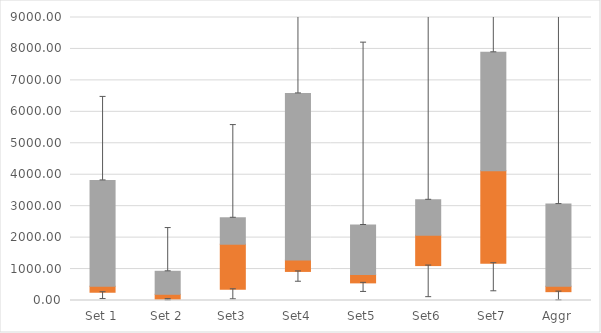
| Category | Q1 | Median-Q1 | Q3-Median |
|---|---|---|---|
| Set 1 | 262.42 | 191.104 | 3366.661 |
| Set 2 | 42.812 | 155.188 | 730.897 |
| Set3 | 356.171 | 1433.594 | 841.4 |
| Set4 | 924.39 | 364.249 | 5298.229 |
| Set5 | 560.473 | 263.255 | 1578.606 |
| Set6 | 1110.463 | 967.655 | 1124.999 |
| Set7 | 1186.183 | 2943.046 | 3764.981 |
| Aggr | 280.866 | 172.657 | 2613.06 |